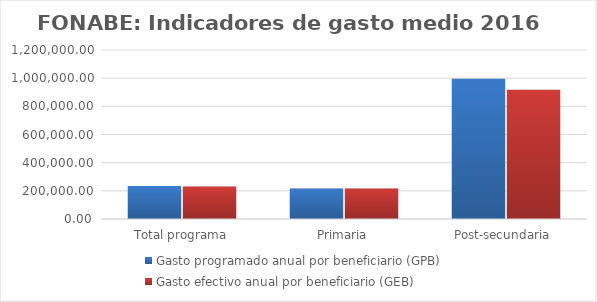
| Category | Gasto programado anual por beneficiario (GPB)  | Gasto efectivo anual por beneficiario (GEB)  |
|---|---|---|
| Total programa | 233775.516 | 230180.784 |
| Primaria | 216000 | 216000 |
| Post-secundaria  | 996000 | 917109.555 |